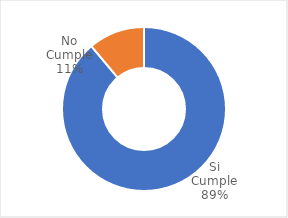
| Category | Series 0 |
|---|---|
| Si Cumple | 0.889 |
| No Cumple | 0.111 |